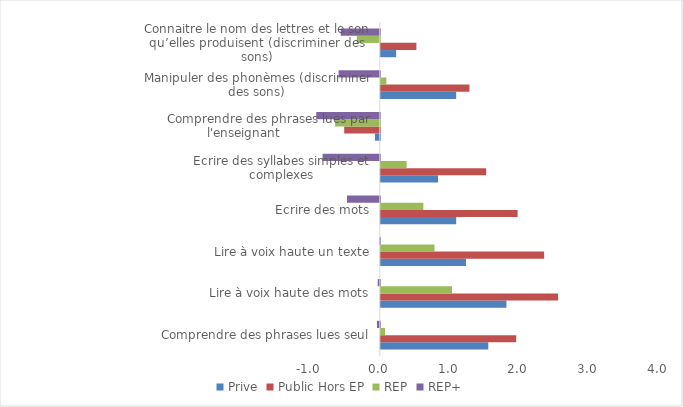
| Category | Prive | Public Hors EP | REP | REP+ |
|---|---|---|---|---|
| Comprendre des phrases lues seul | 1.54 | 1.94 | 0.06 | -0.04 |
| Lire à voix haute des mots | 1.8 | 2.54 | 1.02 | -0.03 |
| Lire à voix haute un texte | 1.22 | 2.34 | 0.77 | -0.01 |
| Ecrire des mots | 1.08 | 1.96 | 0.61 | -0.47 |
| Ecrire des syllabes simples et complexes | 0.82 | 1.51 | 0.37 | -0.82 |
| Comprendre des phrases lues par l'enseignant              | -0.07 | -0.51 | -0.64 | -0.91 |
| Manipuler des phonèmes (discriminer des sons) | 1.08 | 1.27 | 0.08 | -0.59 |
| Connaitre le nom des lettres et le son qu’elles produisent (discriminer des sons) | 0.22 | 0.51 | -0.33 | -0.56 |